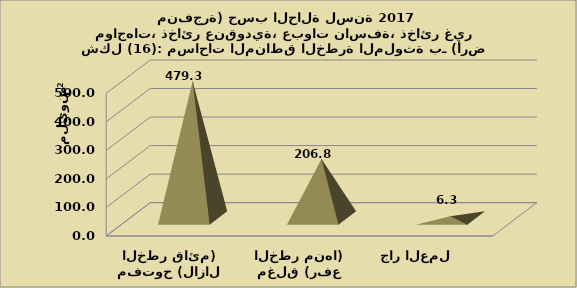
| Category | Series 0 |
|---|---|
| مفتوح (لازال الخطر قائم) | 479.308 |
| مغلق (رفع الخطر منها) | 206.795 |
|  جار العمل      | 6.255 |